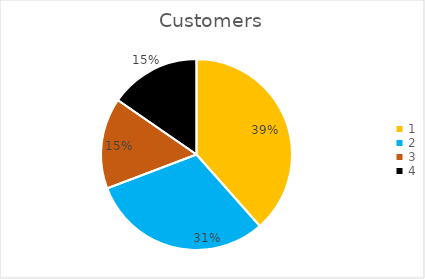
| Category | Series 0 |
|---|---|
| 0 | 0.385 |
| 1 | 0.308 |
| 2 | 0.154 |
| 3 | 0.154 |